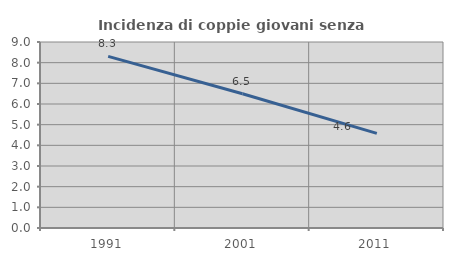
| Category | Incidenza di coppie giovani senza figli |
|---|---|
| 1991.0 | 8.305 |
| 2001.0 | 6.499 |
| 2011.0 | 4.581 |